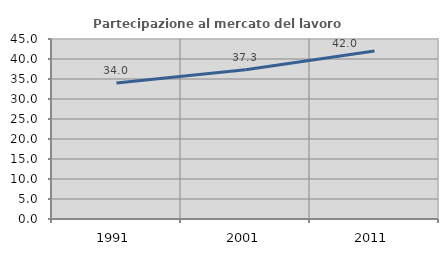
| Category | Partecipazione al mercato del lavoro  femminile |
|---|---|
| 1991.0 | 34.01 |
| 2001.0 | 37.303 |
| 2011.0 | 42.017 |